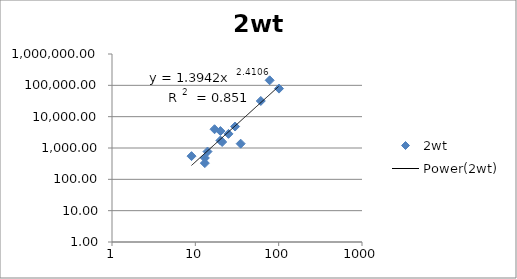
| Category | 2wt |
|---|---|
| 101.0 | 78547.03 |
| 78.0 | 144604.33 |
| 61.0 | 31676.24 |
| 35.0 | 1373.6 |
| 30.0 | 4844.6 |
| 25.0 | 2826.33 |
| 21.0 | 1555.76 |
| 20.0 | 1736.22 |
| 20.0 | 3475.47 |
| 17.0 | 3972.61 |
| 14.0 | 770.97 |
| 13.0 | 329.23 |
| 13.0 | 480.79 |
| 9.0 | 550.06 |